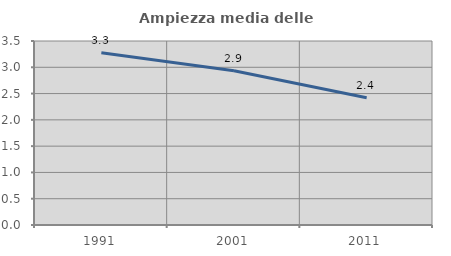
| Category | Ampiezza media delle famiglie |
|---|---|
| 1991.0 | 3.278 |
| 2001.0 | 2.936 |
| 2011.0 | 2.421 |